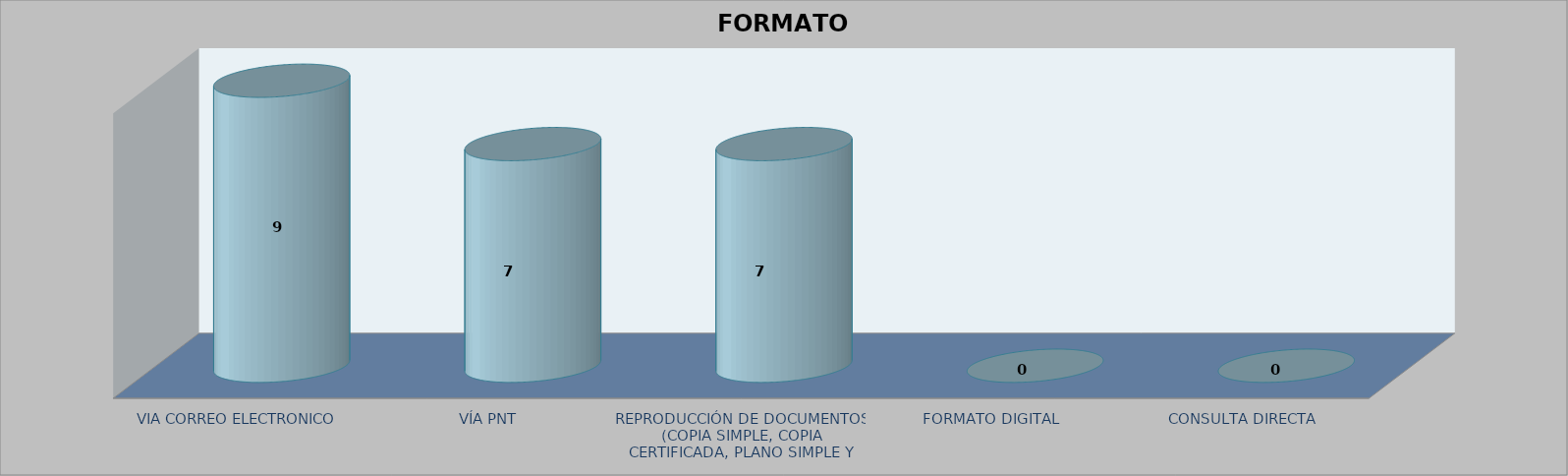
| Category |        FORMATO SOLICITADO | Series 1 | Series 2 |
|---|---|---|---|
| VIA CORREO ELECTRONICO |  |  | 9 |
| VÍA PNT |  |  | 7 |
| REPRODUCCIÓN DE DOCUMENTOS (COPIA SIMPLE, COPIA CERTIFICADA, PLANO SIMPLE Y PLANO CERTIFICADO) |  |  | 7 |
| FORMATO DIGITAL |  |  | 0 |
| CONSULTA DIRECTA |  |  | 0 |